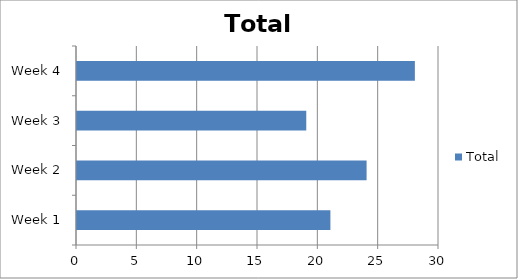
| Category | Total |
|---|---|
| Week 1 | 21 |
| Week 2 | 24 |
| Week 3 | 19 |
| Week 4 | 28 |